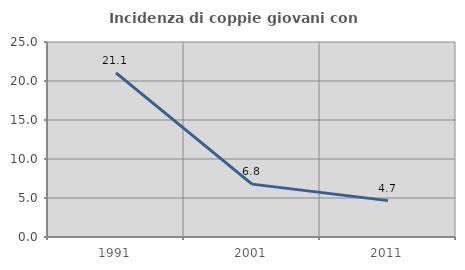
| Category | Incidenza di coppie giovani con figli |
|---|---|
| 1991.0 | 21.053 |
| 2001.0 | 6.78 |
| 2011.0 | 4.663 |